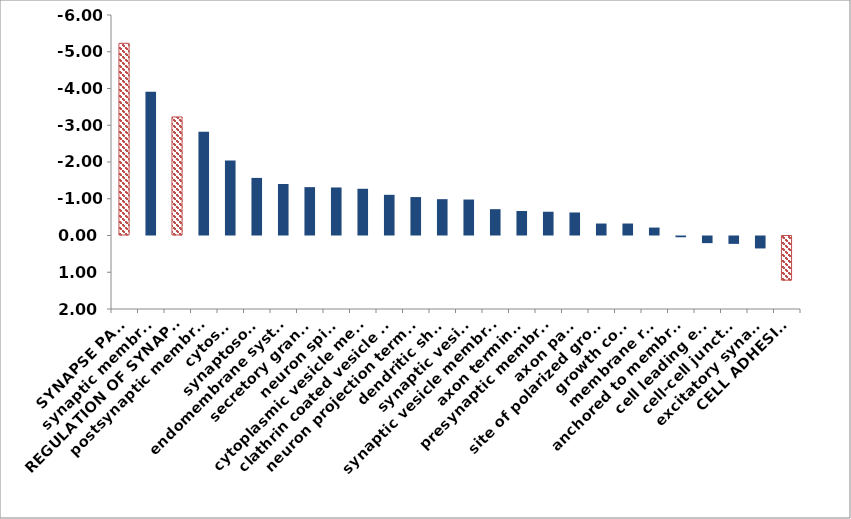
| Category | ∆ log p |
|---|---|
| SYNAPSE PART | -5.23 |
| synaptic membrane | -3.913 |
| REGULATION OF SYNAPTIC PLASTICITY | -3.227 |
| postsynaptic membrane | -2.824 |
| cytosol | -2.041 |
| synaptosome | -1.567 |
| endomembrane system | -1.402 |
| secretory granule | -1.316 |
| neuron spine | -1.307 |
| cytoplasmic vesicle membrane | -1.271 |
| clathrin coated vesicle membrane | -1.107 |
| neuron projection terminus | -1.046 |
| dendritic shaft | -0.989 |
| synaptic vesicle | -0.979 |
| synaptic vesicle membrane | -0.717 |
| axon terminus | -0.666 |
| presynaptic membrane | -0.646 |
| axon part | -0.626 |
| site of polarized growth | -0.326 |
| growth cone | -0.326 |
| membrane raft | -0.216 |
| anchored to membrane | 0.047 |
| cell leading edge | 0.208 |
| cell-cell junction | 0.228 |
| excitatory synapse | 0.352 |
| CELL ADHESION | 1.229 |